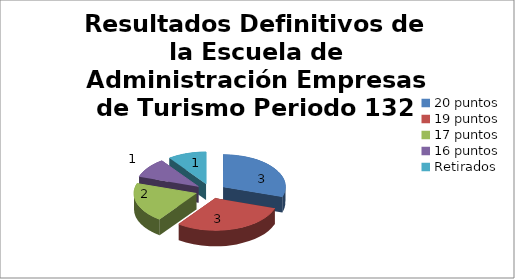
| Category | Series 0 |
|---|---|
| 20 puntos  | 3 |
| 19 puntos | 3 |
| 17 puntos | 2 |
| 16 puntos | 1 |
| Retirados | 1 |